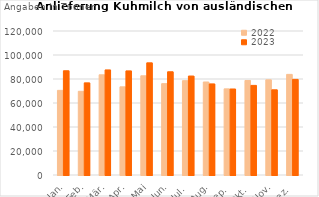
| Category | 2022 | 2023 |
|---|---|---|
| Jan. | 70532.002 | 86873.199 |
| Feb. | 69751.429 | 76778.085 |
| Mär. | 83500.651 | 87564.068 |
| Apr. | 73469.605 | 86747.855 |
| Mai | 82663.147 | 93469.071 |
| Jun. | 76109.662 | 86016.792 |
| Jul. | 78601.104 | 82462.839 |
| Aug. | 77506.47 | 75905.162 |
| Sep. | 71777.346 | 71675.928 |
| Okt. | 78788.473 | 74661.604 |
| Nov. | 79322.665 | 70996.025 |
| Dez. | 83845.939 | 79661.542 |